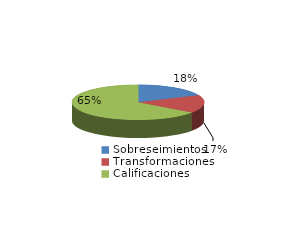
| Category | Series 0 |
|---|---|
| Sobreseimientos | 705 |
| Transformaciones | 647 |
| Calificaciones | 2509 |